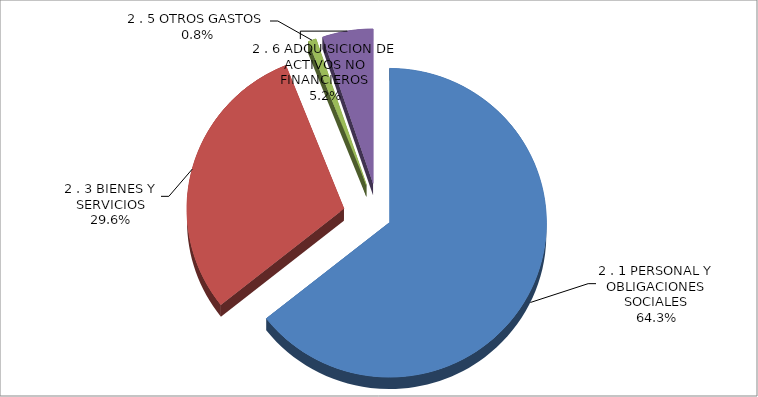
| Category | Series 0 |
|---|---|
| 2 . 1 PERSONAL Y OBLIGACIONES SOCIALES | 50123308 |
| 2 . 3 BIENES Y SERVICIOS | 23073333 |
| 2 . 5 OTROS GASTOS | 646943 |
| 2 . 6 ADQUISICION DE ACTIVOS NO FINANCIEROS | 4062913 |